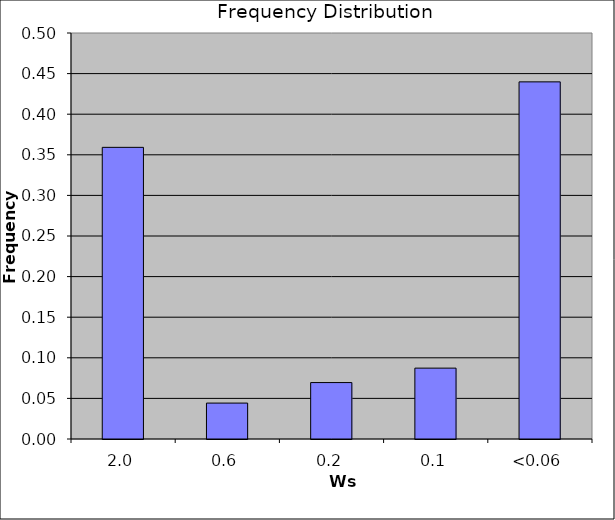
| Category | Frequency Distribution |
|---|---|
| 1.95 | 0.359 |
| 0.65 | 0.044 |
| 0.21 | 0.069 |
| 0.06 | 0.087 |
| <0.06 | 0.44 |